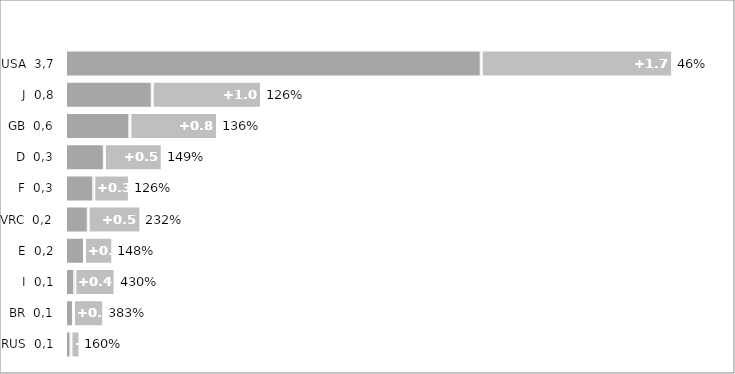
| Category | 2015 | Delta | Abweichungen |
|---|---|---|---|
| RUS  0,1 | 50 | 80 | 1.6 |
| BR  0,1 | 71 | 272 | 3.831 |
| I  0,1 | 84 | 361 | 4.298 |
| E  0,2 | 171 | 253 | 1.48 |
| VRC  0,2 | 204 | 473 | 2.319 |
| F  0,3 | 254 | 320 | 1.26 |
| D  0,3 | 349 | 520 | 1.49 |
| GB  0,6 | 578 | 787 | 1.362 |
| J  0,8 | 779 | 981 | 1.259 |
| USA  3,7 | 3734 | 1719 | 0.46 |